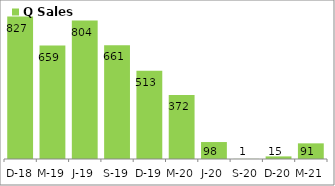
| Category | Q Sales |
|---|---|
| 2018-12-31 | 826.78 |
| 2019-03-31 | 658.83 |
| 2019-06-30 | 803.57 |
| 2019-09-30 | 661.09 |
| 2019-12-31 | 512.92 |
| 2020-03-31 | 371.71 |
| 2020-06-30 | 98.49 |
| 2020-09-30 | 0.69 |
| 2020-12-31 | 15.11 |
| 2021-03-31 | 90.9 |